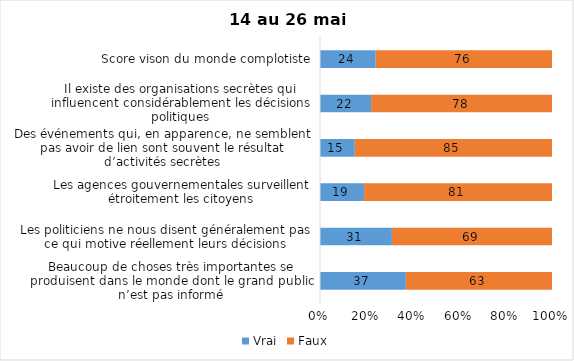
| Category | Vrai | Faux |
|---|---|---|
| Beaucoup de choses très importantes se produisent dans le monde dont le grand public n’est pas informé | 37 | 63 |
| Les politiciens ne nous disent généralement pas ce qui motive réellement leurs décisions | 31 | 69 |
| Les agences gouvernementales surveillent étroitement les citoyens | 19 | 81 |
| Des événements qui, en apparence, ne semblent pas avoir de lien sont souvent le résultat d’activités secrètes | 15 | 85 |
| Il existe des organisations secrètes qui influencent considérablement les décisions politiques | 22 | 78 |
| Score vison du monde complotiste | 24 | 76 |